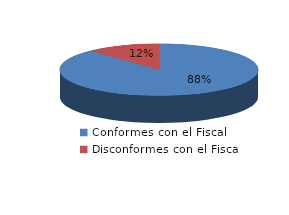
| Category | Series 0 |
|---|---|
| 0 | 731 |
| 1 | 100 |